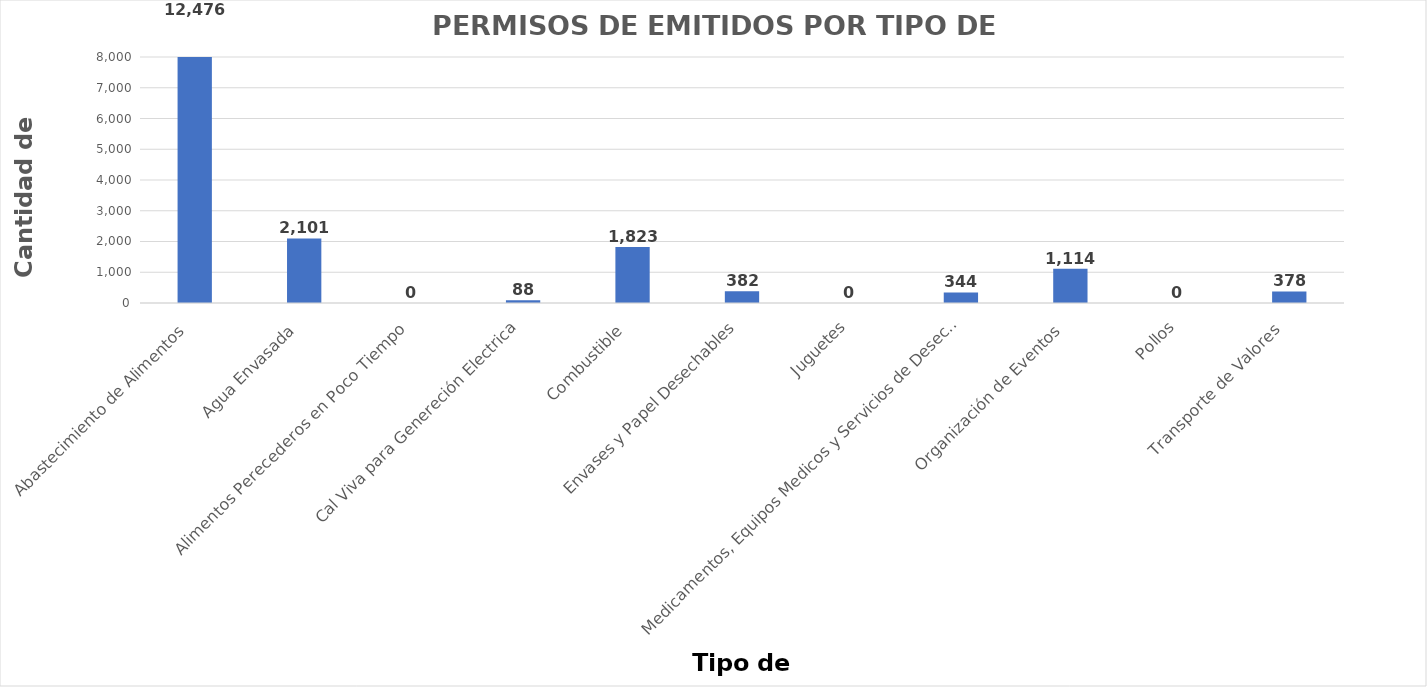
| Category | Series 0 |
|---|---|
| Abastecimiento de Alimentos  | 12476 |
| Agua Envasada  | 2101 |
| Alimentos Perecederos en Poco Tiempo  | 0 |
| Cal Viva para Genereción Electrica | 88 |
| Combustible  | 1823 |
| Envases y Papel Desechables | 382 |
| Juguetes | 0 |
| Medicamentos, Equipos Medicos y Servicios de Desechos Hospitalarios  | 344 |
| Organización de Eventos  | 1114 |
| Pollos | 0 |
| Transporte de Valores  | 378 |